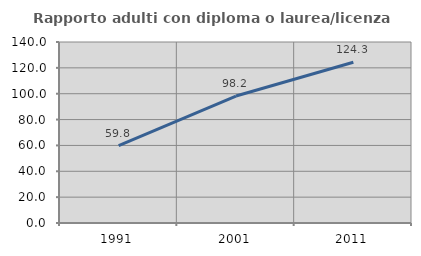
| Category | Rapporto adulti con diploma o laurea/licenza media  |
|---|---|
| 1991.0 | 59.848 |
| 2001.0 | 98.182 |
| 2011.0 | 124.294 |